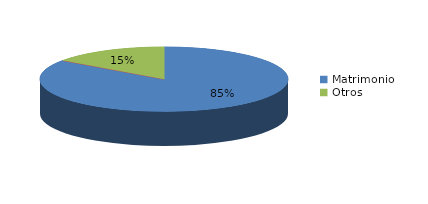
| Category | Series 0 |
|---|---|
| Matrimonio | 2793 |
| Nacionalidad | 0 |
| Otros | 500 |